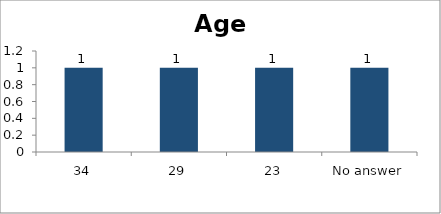
| Category | Age |
|---|---|
| 34 | 1 |
| 29 | 1 |
| 23 | 1 |
| No answer | 1 |